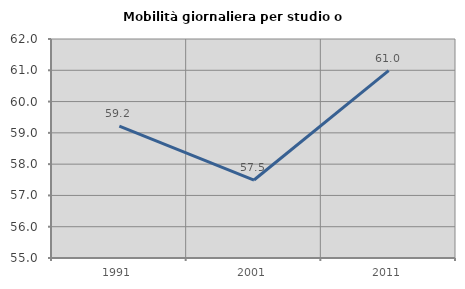
| Category | Mobilità giornaliera per studio o lavoro |
|---|---|
| 1991.0 | 59.218 |
| 2001.0 | 57.492 |
| 2011.0 | 60.987 |